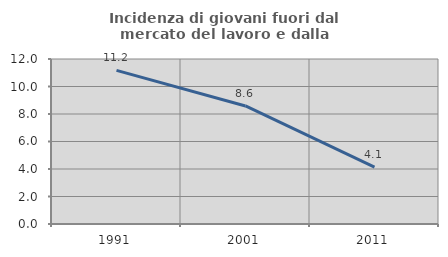
| Category | Incidenza di giovani fuori dal mercato del lavoro e dalla formazione  |
|---|---|
| 1991.0 | 11.17 |
| 2001.0 | 8.586 |
| 2011.0 | 4.142 |